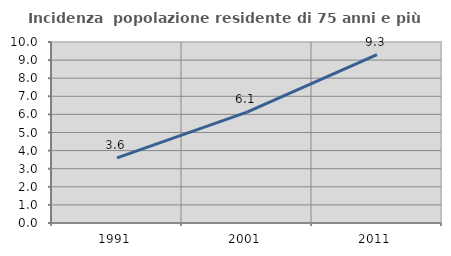
| Category | Incidenza  popolazione residente di 75 anni e più |
|---|---|
| 1991.0 | 3.596 |
| 2001.0 | 6.13 |
| 2011.0 | 9.302 |